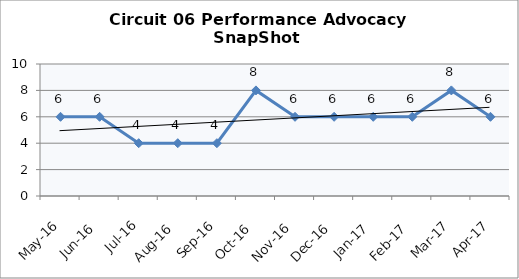
| Category | Circuit 06 |
|---|---|
| May-16 | 6 |
| Jun-16 | 6 |
| Jul-16 | 4 |
| Aug-16 | 4 |
| Sep-16 | 4 |
| Oct-16 | 8 |
| Nov-16 | 6 |
| Dec-16 | 6 |
| Jan-17 | 6 |
| Feb-17 | 6 |
| Mar-17 | 8 |
| Apr-17 | 6 |